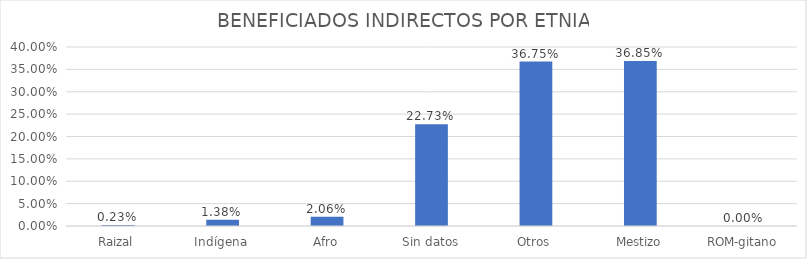
| Category | % |
|---|---|
| Raizal | 0.002 |
| Indígena | 0.014 |
| Afro | 0.021 |
| Sin datos | 0.227 |
| Otros | 0.368 |
| Mestizo | 0.369 |
| ROM-gitano | 0 |